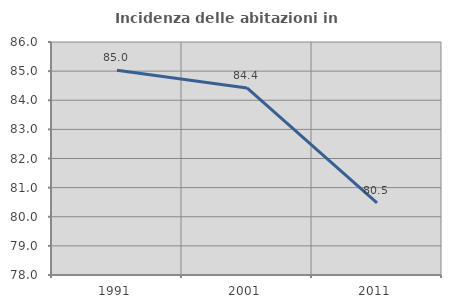
| Category | Incidenza delle abitazioni in proprietà  |
|---|---|
| 1991.0 | 85.03 |
| 2001.0 | 84.422 |
| 2011.0 | 80.476 |